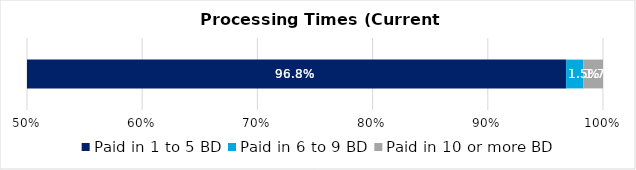
| Category | Paid in 1 to 5 BD | Paid in 6 to 9 BD | Paid in 10 or more BD |
|---|---|---|---|
| 0 | 0.968 | 0.015 | 0.017 |